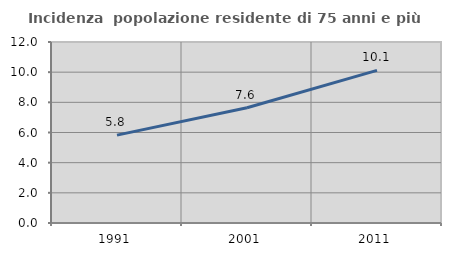
| Category | Incidenza  popolazione residente di 75 anni e più |
|---|---|
| 1991.0 | 5.826 |
| 2001.0 | 7.644 |
| 2011.0 | 10.117 |